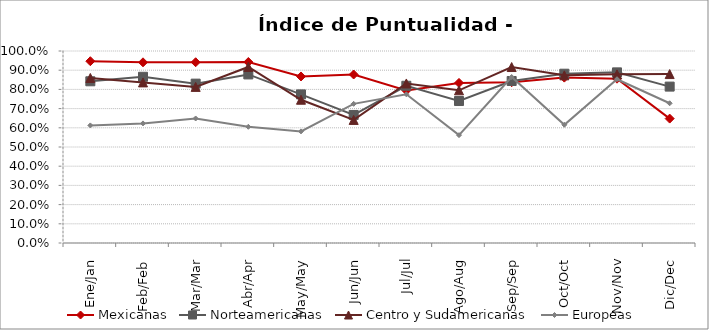
| Category | Mexicanas | Norteamericanas | Centro y Sudamericanas | Europeas |
|---|---|---|---|---|
| Ene/Jan | 0.947 | 0.842 | 0.86 | 0.612 |
| Feb/Feb | 0.941 | 0.866 | 0.837 | 0.623 |
| Mar/Mar | 0.941 | 0.83 | 0.813 | 0.649 |
| Abr/Apr | 0.943 | 0.878 | 0.917 | 0.605 |
| May/May | 0.867 | 0.774 | 0.746 | 0.581 |
| Jun/Jun | 0.878 | 0.667 | 0.641 | 0.725 |
| Jul/Jul | 0.794 | 0.819 | 0.831 | 0.774 |
| Ago/Aug | 0.834 | 0.739 | 0.795 | 0.562 |
| Sep/Sep | 0.837 | 0.844 | 0.916 | 0.865 |
| Oct/Oct | 0.861 | 0.882 | 0.873 | 0.616 |
| Nov/Nov | 0.856 | 0.889 | 0.878 | 0.853 |
| Dic/Dec | 0.648 | 0.815 | 0.88 | 0.728 |